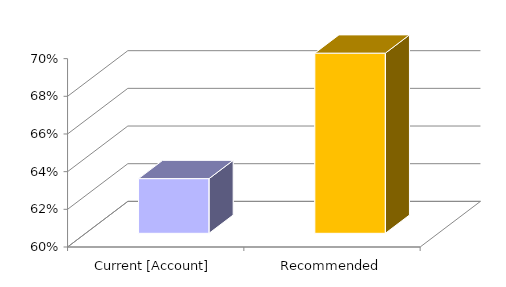
| Category | Series 0 |
|---|---|
| Current [Account] | 0.629 |
| Recommended | 0.696 |